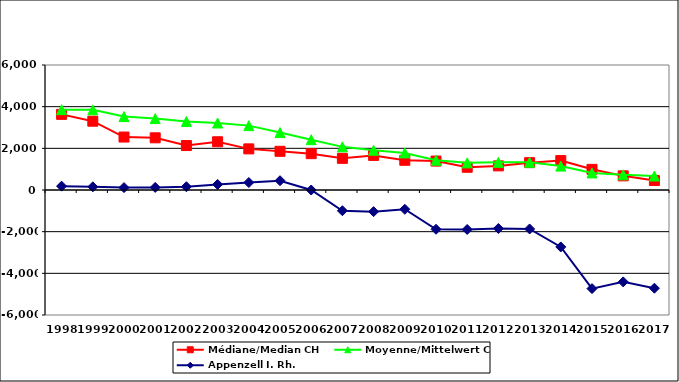
| Category | Médiane/Median CH | Moyenne/Mittelwert CH | Appenzell I. Rh. |
|---|---|---|---|
| 1998.0 | 3630 | 3856.13 | 185 |
| 1999.0 | 3302 | 3847.739 | 153 |
| 2000.0 | 2542 | 3524.64 | 116 |
| 2001.0 | 2505 | 3428.8 | 124 |
| 2002.0 | 2134 | 3290.4 | 157 |
| 2003.0 | 2316 | 3215.6 | 268 |
| 2004.0 | 1974 | 3090.325 | 360 |
| 2005.0 | 1858 | 2756.351 | 445 |
| 2006.0 | 1744.5 | 2416.426 | 0 |
| 2007.0 | 1520 | 2070.521 | -994 |
| 2008.0 | 1660 | 1907.634 | -1039 |
| 2009.0 | 1426 | 1780.53 | -925 |
| 2010.0 | 1388.8 | 1427.327 | -1884 |
| 2011.0 | 1091 | 1302.405 | -1894 |
| 2012.0 | 1157.645 | 1326.071 | -1847 |
| 2013.0 | 1313 | 1328.597 | -1870 |
| 2014.0 | 1412.435 | 1147.291 | -2733 |
| 2015.0 | 992 | 819.292 | -4733 |
| 2016.0 | 679 | 729.357 | -4410 |
| 2017.0 | 456.291 | 671.325 | -4714 |